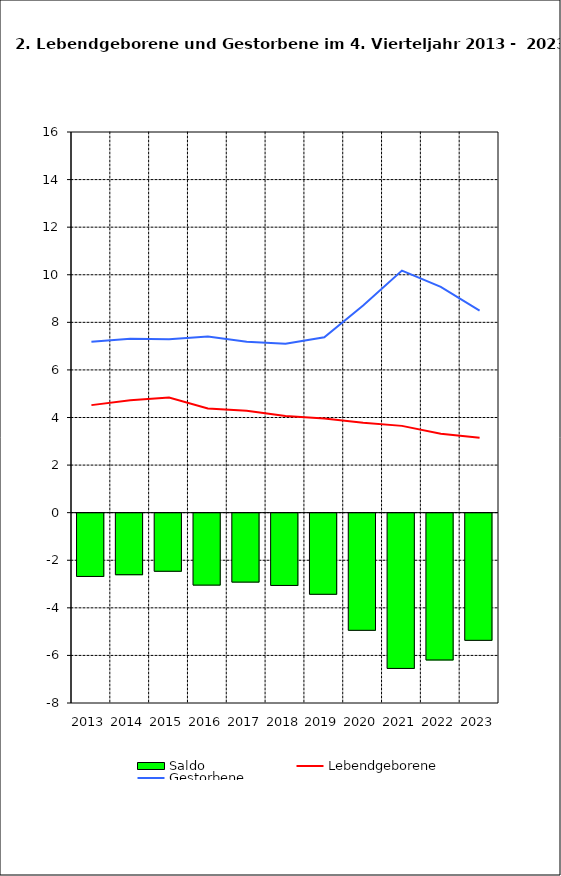
| Category | Saldo |
|---|---|
| 2013.0 | -2.66 |
| 2014.0 | -2.587 |
| 2015.0 | -2.442 |
| 2016.0 | -3.024 |
| 2017.0 | -2.898 |
| 2018.0 | -3.038 |
| 2019.0 | -3.41 |
| 2020.0 | -4.924 |
| 2021.0 | -6.526 |
| 2022.0 | -6.171 |
| 2023.0 | -5.345 |